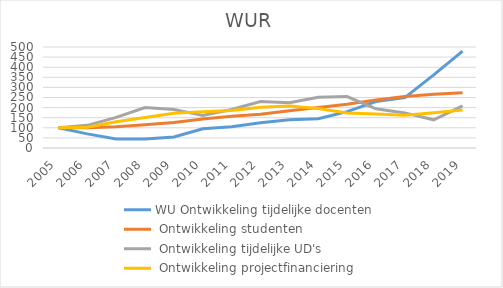
| Category | WU |
|---|---|
| 2005.0 | 100 |
| 2006.0 | 102.688 |
| 2007.0 | 129.86 |
| 2008.0 | 151.059 |
| 2009.0 | 172.058 |
| 2010.0 | 179.666 |
| 2011.0 | 185.287 |
| 2012.0 | 201.469 |
| 2013.0 | 208.253 |
| 2014.0 | 195.052 |
| 2015.0 | 173.793 |
| 2016.0 | 167.771 |
| 2017.0 | 162.308 |
| 2018.0 | 174.415 |
| 2019.0 | 188.291 |